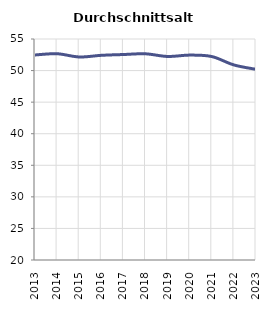
| Category | Durchschnittsalter |
|---|---|
| 2013.0 | 52.47 |
| 2014.0 | 52.666 |
| 2015.0 | 52.153 |
| 2016.0 | 52.414 |
| 2017.0 | 52.542 |
| 2018.0 | 52.655 |
| 2019.0 | 52.231 |
| 2020.0 | 52.45 |
| 2021.0 | 52.223 |
| 2022.0 | 50.89 |
| 2023.0 | 50.197 |